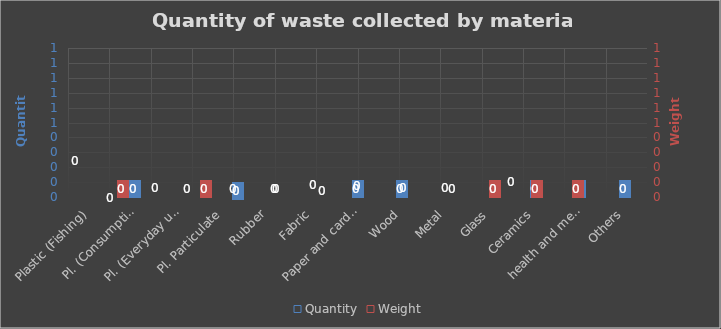
| Category | Quantity |
|---|---|
| Plastic (Fishing) | 0 |
| Pl. (Consumption) | 0 |
| Pl. (Everyday use) | 0 |
| Pl. Particulate | 0 |
| Rubber | 0 |
| Fabric | 0 |
| Paper and cardboard | 0 |
| Wood | 0 |
| Metal | 0 |
| Glass | 0 |
| Ceramics | 0 |
| health and medical | 0 |
| Others | 0 |